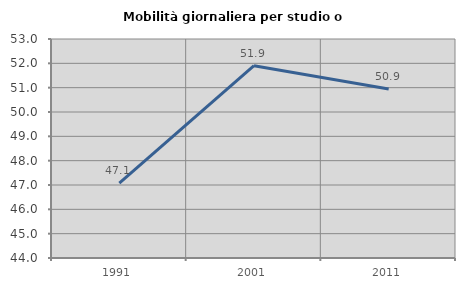
| Category | Mobilità giornaliera per studio o lavoro |
|---|---|
| 1991.0 | 47.076 |
| 2001.0 | 51.904 |
| 2011.0 | 50.946 |